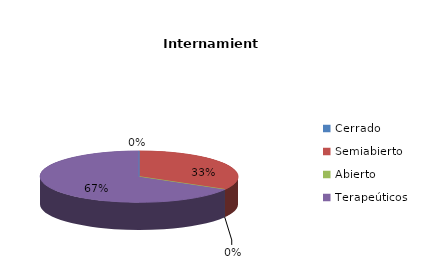
| Category | Series 0 |
|---|---|
| Cerrado | 0 |
| Semiabierto | 1 |
| Abierto | 0 |
| Terapeúticos | 2 |